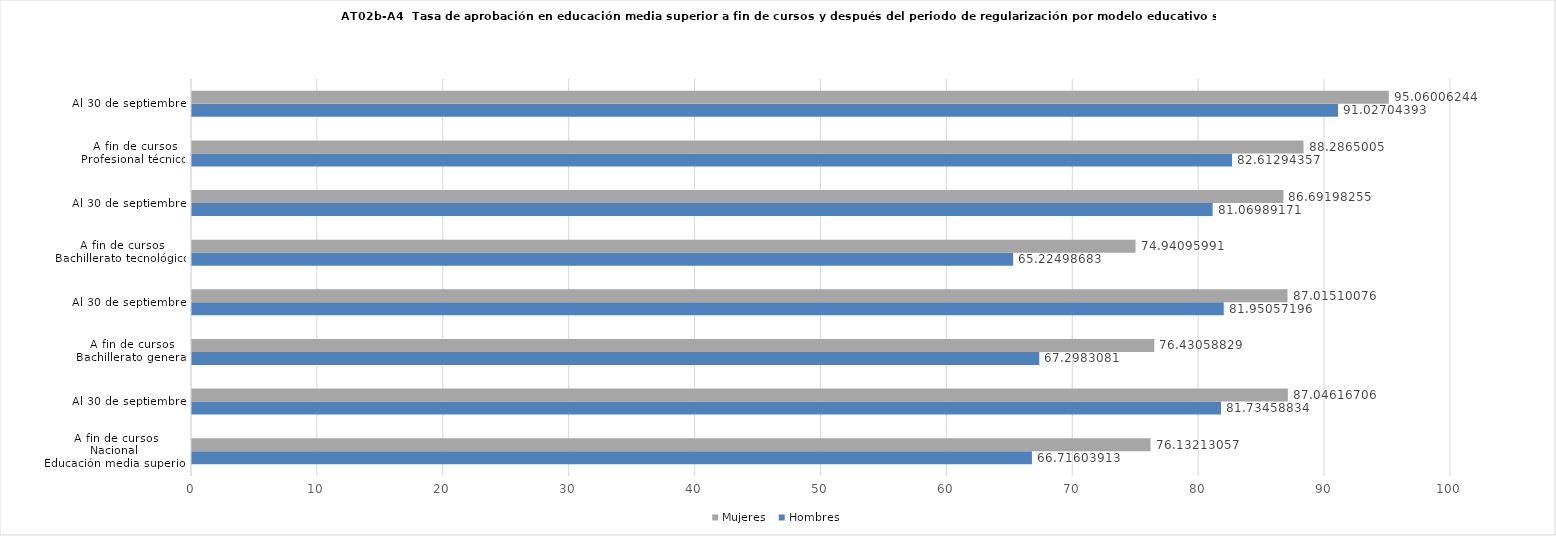
| Category | Hombres | Mujeres |
|---|---|---|
| 0 | 66.716 | 76.132 |
| 1 | 81.735 | 87.046 |
| 2 | 67.298 | 76.431 |
| 3 | 81.951 | 87.015 |
| 4 | 65.225 | 74.941 |
| 5 | 81.07 | 86.692 |
| 6 | 82.613 | 88.287 |
| 7 | 91.027 | 95.06 |